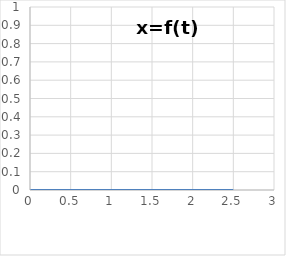
| Category | Series 0 |
|---|---|
| 0.0 | 0 |
| 0.125 | 0 |
| 0.25 | 0 |
| 0.375 | 0 |
| 0.5 | 0 |
| 0.625 | 0 |
| 0.75 | 0 |
| 0.875 | 0 |
| 1.0 | 0 |
| 1.125 | 0 |
| 1.25 | 0 |
| 1.375 | 0 |
| 1.5 | 0 |
| 1.625 | 0 |
| 1.75 | 0 |
| 1.875 | 0 |
| 2.0 | 0 |
| 2.125 | 0 |
| 2.25 | 0 |
| 2.375 | 0 |
| 2.5 | 0 |